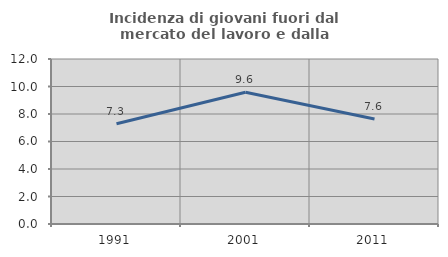
| Category | Incidenza di giovani fuori dal mercato del lavoro e dalla formazione  |
|---|---|
| 1991.0 | 7.294 |
| 2001.0 | 9.586 |
| 2011.0 | 7.64 |